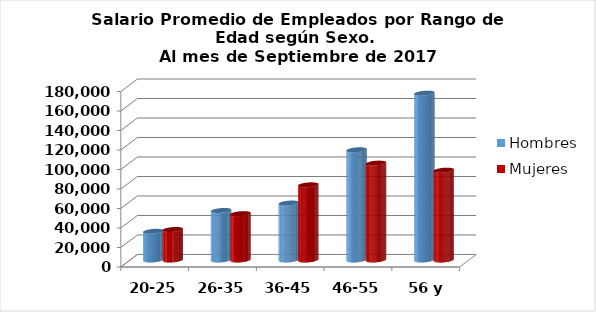
| Category | Hombres | Mujeres |
|---|---|---|
| 20-25 | 29412.222 | 31297.059 |
| 26-35 | 50810.596 | 47556.367 |
| 36-45 | 58416.104 | 77089.812 |
| 46-55 | 113060.643 | 99372.974 |
| 56 y más | 171120.222 | 92126.257 |